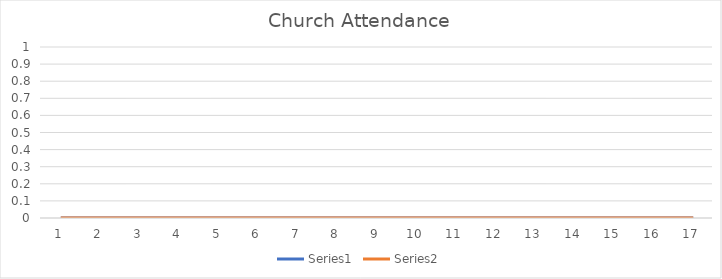
| Category | Series 0 | Series 1 |
|---|---|---|
| 0 | 0 | 0 |
| 1 | 0 | 0 |
| 2 | 0 | 0 |
| 3 | 0 | 0 |
| 4 | 0 | 0 |
| 5 | 0 | 0 |
| 6 | 0 | 0 |
| 7 | 0 | 0 |
| 8 | 0 | 0 |
| 9 | 0 | 0 |
| 10 | 0 | 0 |
| 11 | 0 | 0 |
| 12 | 0 | 0 |
| 13 | 0 | 0 |
| 14 | 0 | 0 |
| 15 | 0 | 0 |
| 16 | 0 | 0 |